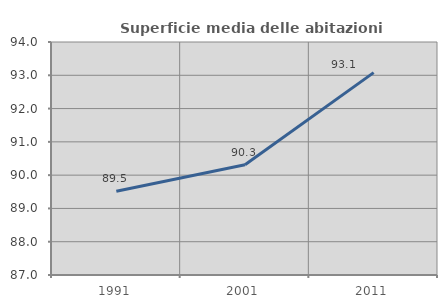
| Category | Superficie media delle abitazioni occupate |
|---|---|
| 1991.0 | 89.518 |
| 2001.0 | 90.312 |
| 2011.0 | 93.08 |